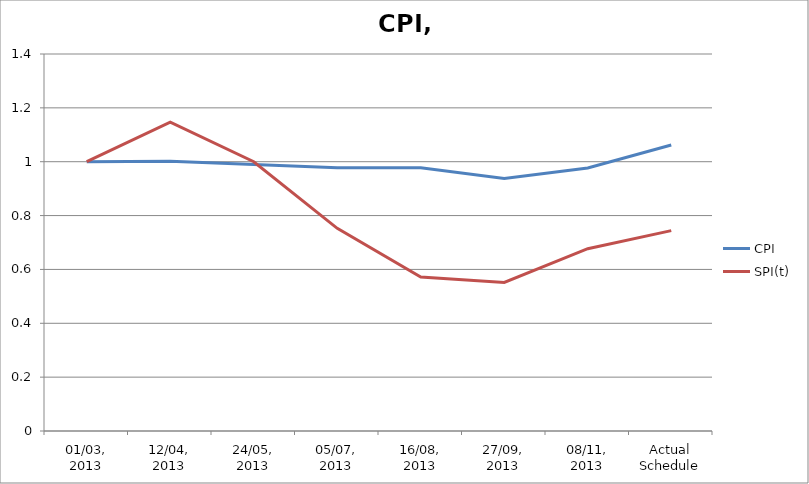
| Category | CPI | SPI(t) |
|---|---|---|
| 01/03, 2013 | 1 | 1 |
| 12/04, 2013 | 1.001 | 1.147 |
| 24/05, 2013 | 0.989 | 1 |
| 05/07, 2013 | 0.977 | 0.753 |
| 16/08, 2013 | 0.977 | 0.572 |
| 27/09, 2013 | 0.937 | 0.552 |
| 08/11, 2013 | 0.977 | 0.677 |
| Actual Schedule | 1.062 | 0.744 |